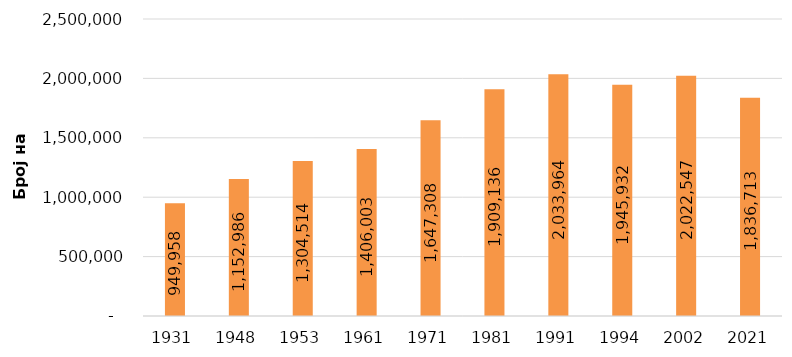
| Category | вкупно |
|---|---|
| 1931 | 949958 |
| 1948 | 1152986 |
| 1953 | 1304514 |
| 1961 | 1406003 |
| 1971 | 1647308 |
| 1981 | 1909136 |
| 1991 | 2033964 |
| 1994 | 1945932 |
| 2002 | 2022547 |
| 2021 | 1836713 |